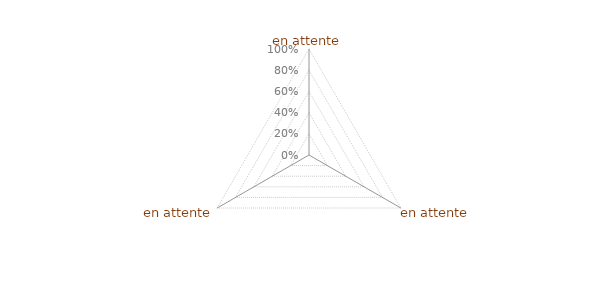
| Category | Article 9 |
|---|---|
| 0 | 0 |
| 1 | 0 |
| 2 | 0 |